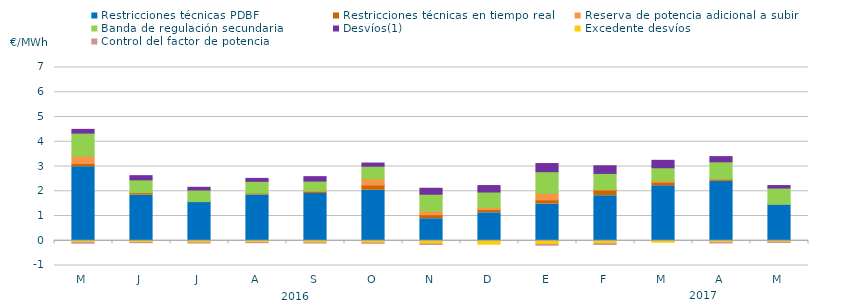
| Category | Restricciones técnicas PDBF | Restricciones técnicas en tiempo real | Reserva de potencia adicional a subir | Banda de regulación secundaria | Desvíos(1) | Excedente desvíos | Control del factor de potencia |
|---|---|---|---|---|---|---|---|
| M | 2.99 | 0.13 | 0.3 | 0.93 | 0.15 | -0.07 | -0.07 |
| J | 1.84 | 0.1 | 0 | 0.52 | 0.17 | -0.07 | -0.05 |
| J | 1.55 | 0.03 | 0 | 0.47 | 0.11 | -0.08 | -0.05 |
| A | 1.85 | 0.07 | 0 | 0.48 | 0.12 | -0.07 | -0.05 |
| S | 1.91 | 0.09 | 0.02 | 0.39 | 0.18 | -0.08 | -0.05 |
| O | 2.04 | 0.21 | 0.25 | 0.51 | 0.13 | -0.09 | -0.05 |
| N | 0.89 | 0.16 | 0.15 | 0.68 | 0.24 | -0.13 | -0.06 |
| D | 1.13 | 0.13 | 0.08 | 0.63 | 0.26 | -0.14 | 0 |
| E | 1.48 | 0.17 | 0.27 | 0.87 | 0.33 | -0.15 | -0.07 |
| F | 1.82 | 0.23 | 0.02 | 0.65 | 0.31 | -0.12 | -0.07 |
| M | 2.22 | 0.14 | 0.07 | 0.52 | 0.3 | -0.06 | 0 |
| A | 2.4 | 0.09 | 0.01 | 0.69 | 0.21 | -0.07 | -0.06 |
| M | 1.45 | 0.03 | 0 | 0.65 | 0.1 | -0.06 | -0.05 |